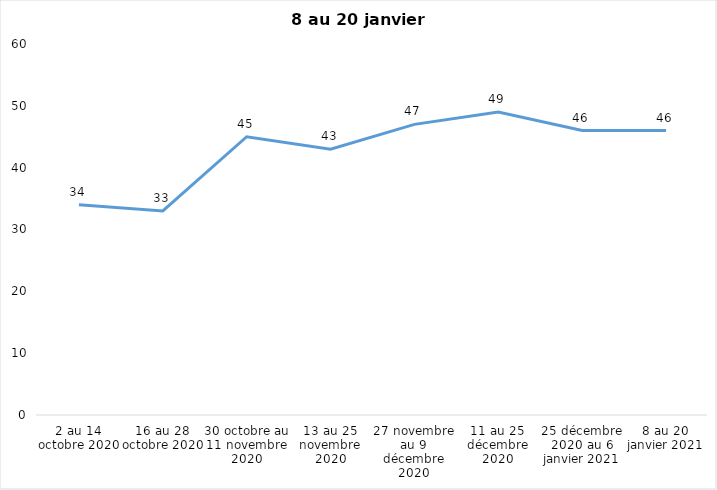
| Category | Toujours aux trois mesures |
|---|---|
| 2 au 14 octobre 2020 | 34 |
| 16 au 28 octobre 2020 | 33 |
| 30 octobre au 11 novembre 2020 | 45 |
| 13 au 25 novembre 2020 | 43 |
| 27 novembre au 9 décembre 2020 | 47 |
| 11 au 25 décembre 2020 | 49 |
| 25 décembre 2020 au 6 janvier 2021 | 46 |
| 8 au 20 janvier 2021 | 46 |